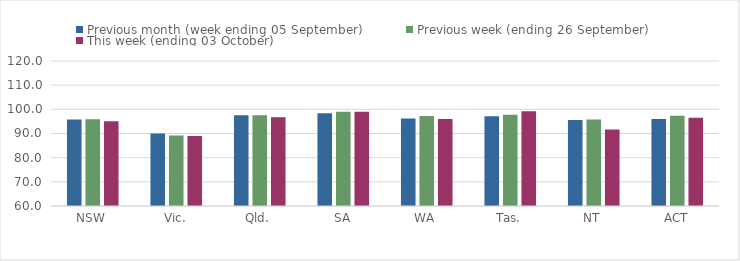
| Category | Previous month (week ending 05 September) | Previous week (ending 26 September) | This week (ending 03 October) |
|---|---|---|---|
| NSW | 95.77 | 95.87 | 95.03 |
| Vic. | 90.04 | 89.17 | 88.92 |
| Qld. | 97.53 | 97.57 | 96.75 |
| SA | 98.33 | 99 | 99.01 |
| WA | 96.23 | 97.21 | 96.01 |
| Tas. | 97.17 | 97.8 | 99.21 |
| NT | 95.56 | 95.83 | 91.69 |
| ACT | 95.98 | 97.31 | 96.48 |